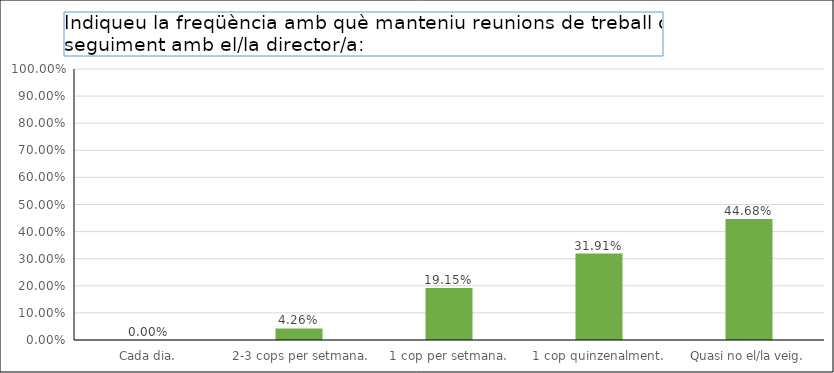
| Category | Series 0 |
|---|---|
| Cada dia. | 0 |
|  2-3 cops per setmana. | 0.043 |
| 1 cop per setmana. | 0.191 |
| 1 cop quinzenalment. | 0.319 |
| Quasi no el/la veig. | 0.447 |